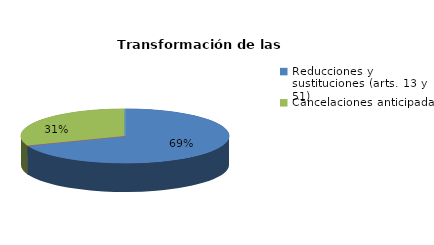
| Category | Series 0 |
|---|---|
| Reducciones y sustituciones (arts. 13 y 51) | 9 |
| Por quebrantamiento (art. 50.2) | 0 |
| Cancelaciones anticipadas | 4 |
| Traslado a Centros Penitenciarios | 0 |
| Conversión internamientos en cerrados (art. 51.2) | 0 |